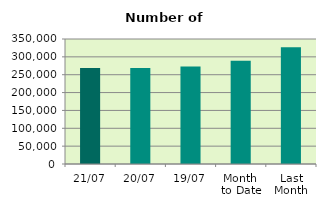
| Category | Series 0 |
|---|---|
| 21/07 | 268486 |
| 20/07 | 268896 |
| 19/07 | 272814 |
| Month 
to Date | 288994.533 |
| Last
Month | 326674.818 |